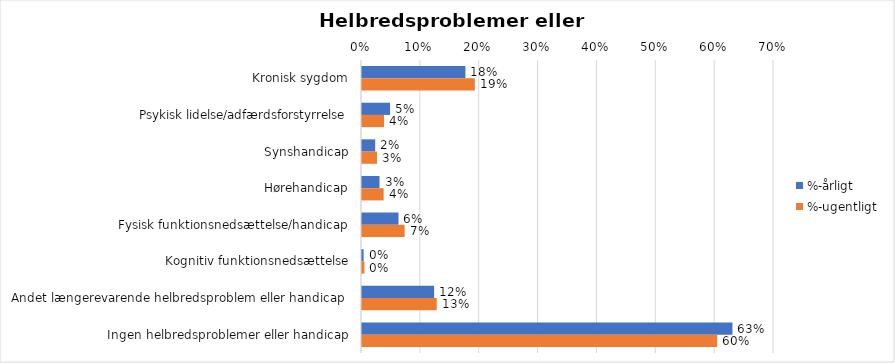
| Category | %-årligt | %-ugentligt |
|---|---|---|
| Kronisk sygdom | 0.176 | 0.192 |
| Psykisk lidelse/adfærdsforstyrrelse | 0.048 | 0.037 |
| Synshandicap | 0.022 | 0.026 |
| Hørehandicap | 0.03 | 0.037 |
| Fysisk funktionsnedsættelse/handicap | 0.062 | 0.072 |
| Kognitiv funktionsnedsættelse | 0.003 | 0.004 |
| Andet længerevarende helbredsproblem eller handicap  | 0.123 | 0.127 |
| Ingen helbredsproblemer eller handicap | 0.629 | 0.604 |